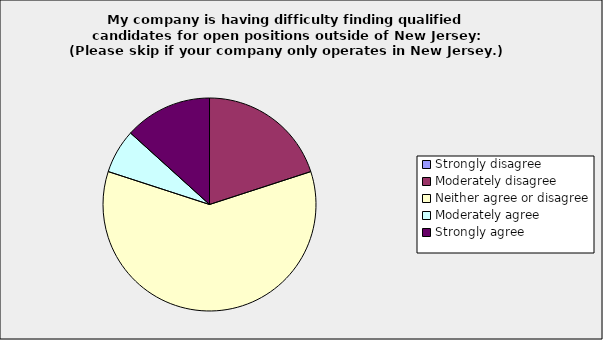
| Category | Series 0 |
|---|---|
| Strongly disagree | 0 |
| Moderately disagree | 0.2 |
| Neither agree or disagree | 0.6 |
| Moderately agree | 0.067 |
| Strongly agree | 0.133 |